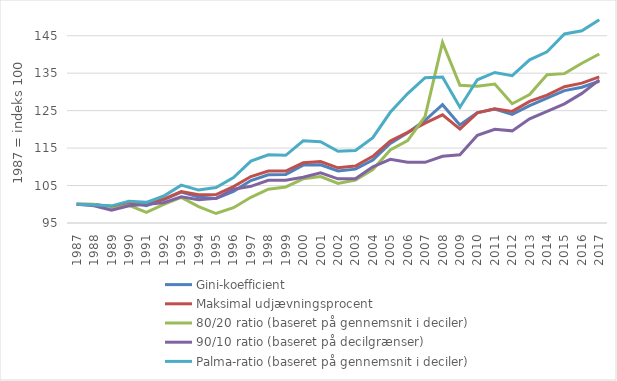
| Category | Gini-koefficient | Maksimal udjævningsprocent | 80/20 ratio (baseret på gennemsnit i deciler) | 90/10 ratio (baseret på decilgrænser) | Palma-ratio (baseret på gennemsnit i deciler) |
|---|---|---|---|---|---|
| 1987 | 100 | 100 | 100 | 100 | 100 |
| 1988 | 99.955 | 99.933 | 100 | 99.6 | 99.823 |
| 1989 | 99.366 | 99.267 | 98.765 | 98.4 | 99.576 |
| 1990 | 100.408 | 100.267 | 99.691 | 99.6 | 100.8 |
| 1991 | 99.638 | 100 | 97.84 | 100 | 100.509 |
| 1992 | 101.223 | 101.4 | 100 | 100.4 | 102.202 |
| 1993 | 103.262 | 103.4 | 101.852 | 102 | 105.111 |
| 1994 | 101.948 | 102.533 | 99.383 | 101.2 | 103.788 |
| 1995 | 101.541 | 102.6 | 97.531 | 101.6 | 104.485 |
| 1996 | 103.444 | 104.733 | 99.074 | 104 | 107.15 |
| 1997 | 106.343 | 107.4 | 101.852 | 104.8 | 111.534 |
| 1998 | 107.884 | 108.867 | 104.012 | 106.4 | 113.212 |
| 1999 | 107.975 | 108.867 | 104.63 | 106.4 | 113.064 |
| 2000 | 110.467 | 111.067 | 106.79 | 107.2 | 116.957 |
| 2001 | 110.557 | 111.4 | 107.407 | 108.4 | 116.705 |
| 2002 | 108.881 | 109.733 | 105.556 | 106.8 | 114.167 |
| 2003 | 109.379 | 110.2 | 106.481 | 106.8 | 114.367 |
| 2004 | 111.826 | 112.8 | 109.259 | 110 | 117.781 |
| 2005 | 116.266 | 116.867 | 114.506 | 112 | 124.554 |
| 2006 | 119.076 | 119.2 | 116.975 | 111.2 | 129.559 |
| 2007 | 122.429 | 121.667 | 123.457 | 111.2 | 133.795 |
| 2008 | 126.597 | 123.867 | 143.21 | 112.8 | 133.949 |
| 2009 | 121.16 | 120.067 | 131.79 | 113.2 | 125.922 |
| 2010 | 124.468 | 124.4 | 131.481 | 118.4 | 133.242 |
| 2011 | 125.419 | 125.467 | 132.099 | 120 | 135.186 |
| 2012 | 124.014 | 124.8 | 126.852 | 119.6 | 134.351 |
| 2013 | 126.325 | 127.467 | 129.321 | 122.8 | 138.558 |
| 2014 | 128.364 | 129.133 | 134.568 | 124.8 | 140.713 |
| 2015 | 130.358 | 131.4 | 134.877 | 126.8 | 145.486 |
| 2016 | 131.264 | 132.333 | 137.654 | 129.6 | 146.341 |
| 2017 | 132.85 | 134 | 140.123 | 133.2 | 149.289 |